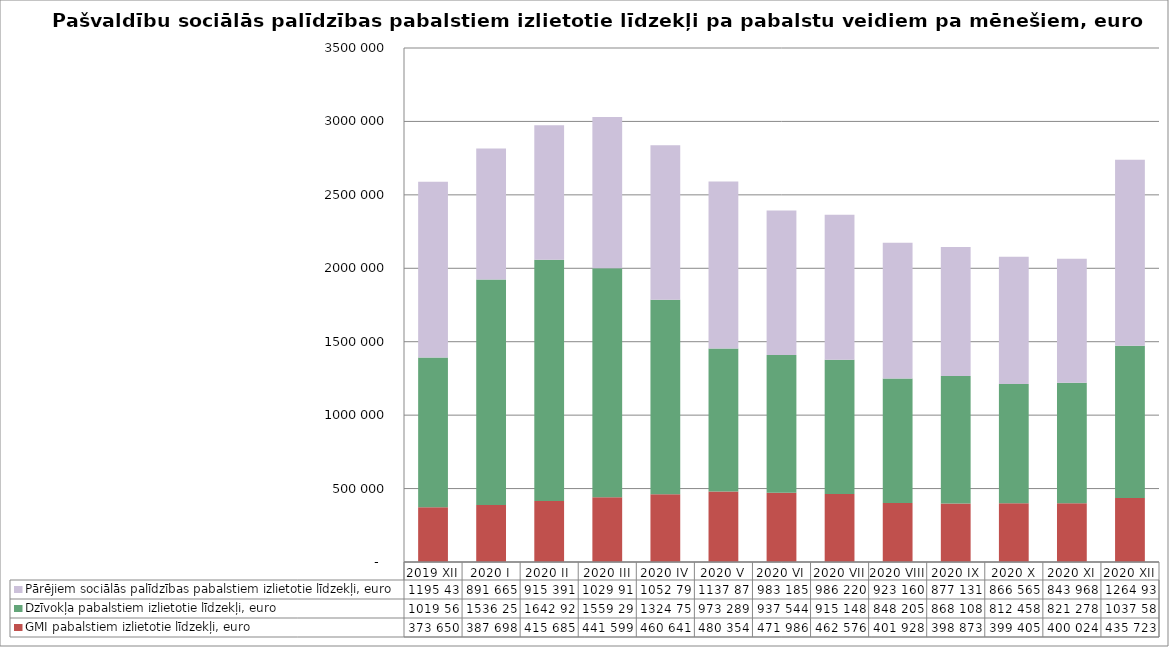
| Category | GMI pabalstiem izlietotie līdzekļi, euro | Dzīvokļa pabalstiem izlietotie līdzekļi, euro | Pārējiem sociālās palīdzības pabalstiem izlietotie līdzekļi, euro  |
|---|---|---|---|
| 2019 XII | 373650 | 1019563 | 1195436 |
| 2020 I | 387698 | 1536256 | 891665 |
| 2020 II  | 415685 | 1642928 | 915391 |
| 2020 III | 441599 | 1559294 | 1029914 |
| 2020 IV | 460641 | 1324759 | 1052795 |
| 2020 V | 480354 | 973289 | 1137879 |
| 2020 VI | 471986 | 937544 | 983185 |
| 2020 VII | 462576 | 915148 | 986220 |
| 2020 VIII | 401928 | 848205 | 923160 |
| 2020 IX | 398873 | 868108 | 877131 |
| 2020 X | 399405 | 812458 | 866565 |
| 2020 XI | 400024 | 821278 | 843968 |
| 2020 XII | 435723 | 1037589 | 1264936 |